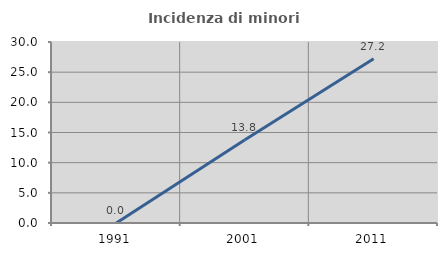
| Category | Incidenza di minori stranieri |
|---|---|
| 1991.0 | 0 |
| 2001.0 | 13.793 |
| 2011.0 | 27.217 |